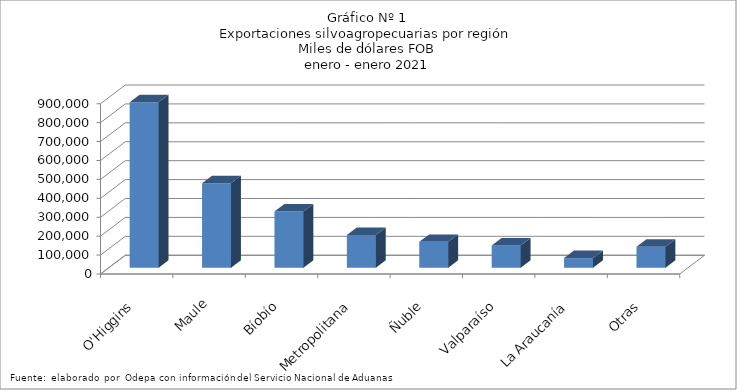
| Category | Series 0 |
|---|---|
| O'Higgins | 874670.851 |
| Maule | 446712.732 |
| Bíobío | 297497.489 |
| Metropolitana | 173444.279 |
| Ñuble | 136767.142 |
| Valparaíso | 117990.445 |
| La Araucanía | 51068.189 |
| Otras | 110767.896 |